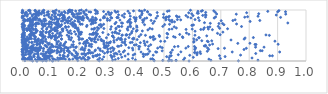
| Category | Series 0 |
|---|---|
| 0.20659024617600152 | 0.722 |
| 0.1595882859350992 | 0.769 |
| 0.5022783122837734 | 0.714 |
| 0.014627011601735303 | 0.221 |
| 0.8708775679135857 | 0.502 |
| 0.1238269095024919 | 0.456 |
| 0.2748066383766688 | 0.237 |
| 0.5081700501069504 | 0.863 |
| 0.5369264353859214 | 0.281 |
| 0.22940533535306296 | 0.403 |
| 0.0507291012930598 | 0.929 |
| 0.08151948562963185 | 0.039 |
| 0.23282890487622582 | 0.153 |
| 0.3509470010056096 | 0.419 |
| 0.1350176189112731 | 0.062 |
| 0.46287678871345395 | 0.481 |
| 0.011119935692606994 | 0.28 |
| 0.645812839691758 | 0.293 |
| 0.41077523659619003 | 0.284 |
| 0.38567772816234314 | 0.549 |
| 0.04700696801618684 | 0.032 |
| 0.6532315311546384 | 0.257 |
| 0.3492561073725203 | 0.304 |
| 0.011562703818986648 | 0.356 |
| 0.08128342170374568 | 0.69 |
| 0.21867603945372405 | 0.966 |
| 0.4439375430555527 | 0.231 |
| 0.24468991328158657 | 0.808 |
| 0.005265783653080119 | 0.597 |
| 0.03794246538813923 | 0.541 |
| 0.12398156293495016 | 0.216 |
| 0.5194820389745708 | 0.72 |
| 0.25600010063105594 | 0.641 |
| 0.5727020444227984 | 0.055 |
| 0.26732817516646984 | 0.42 |
| 0.16612893364222417 | 0.035 |
| 0.4982095696546795 | 0.854 |
| 0.2536260374636236 | 0.626 |
| 0.0406699299817603 | 0.248 |
| 0.2839238283861116 | 0.188 |
| 0.39290793220228815 | 0.43 |
| 0.5985147892601438 | 0.699 |
| 0.042279848248976404 | 0.533 |
| 0.4938443133912794 | 0.26 |
| 0.2620367883453557 | 0.82 |
| 0.16580611699807202 | 0.428 |
| 0.0004538340856108784 | 0.72 |
| 0.05547881544473306 | 0.153 |
| 0.06889590535984585 | 0.556 |
| 0.16266129144415303 | 0.567 |
| 0.8307884937646091 | 0.016 |
| 0.3338823724559998 | 0.415 |
| 0.1186083175830136 | 0.506 |
| 0.20101279854767606 | 0.421 |
| 0.0937517599832609 | 0.921 |
| 0.6934723897624867 | 0.735 |
| 0.20476507593976015 | 0.86 |
| 0.04120971670585925 | 0.914 |
| 0.1692985936536823 | 0.965 |
| 0.28629885539675737 | 0.845 |
| 0.0009645296041806804 | 0.123 |
| 0.5360201400004413 | 0.67 |
| 0.0014370166668378303 | 0.038 |
| 0.21203614964695036 | 0.722 |
| 0.08747721386081674 | 0.644 |
| 0.16131557928945228 | 0.939 |
| 0.05291620713172245 | 0.359 |
| 0.027992955133127384 | 0.2 |
| 0.07465261850898208 | 0.587 |
| 0.28460917675159086 | 0.558 |
| 0.06789787563027082 | 0.409 |
| 0.21964435155825754 | 0.205 |
| 0.09632525314077586 | 0.349 |
| 0.10674355390600654 | 0 |
| 0.4655703801737191 | 0.005 |
| 0.22894828137979076 | 0.699 |
| 0.23297248603286644 | 0.071 |
| 0.16661025624676912 | 0.999 |
| 0.1603126596140355 | 0.087 |
| 0.04164822182434544 | 0.091 |
| 0.0176482055008865 | 0.878 |
| 0.32437265296795914 | 0.143 |
| 0.17775796684123046 | 0.12 |
| 0.027276738055447277 | 0.626 |
| 0.35143894812218546 | 0.678 |
| 0.045162385770139826 | 0.445 |
| 0.2912353454635478 | 0.295 |
| 0.2892176773023869 | 0.266 |
| 0.044096376337534555 | 0.217 |
| 0.2268841744466071 | 0.907 |
| 0.19620719389889232 | 0.008 |
| 0.14626610581343039 | 0.867 |
| 0.08781791734118258 | 0.172 |
| 0.8025133796760705 | 0.348 |
| 0.5243593504559144 | 0.161 |
| 0.02098822196703764 | 0.631 |
| 0.013335016458879806 | 0.799 |
| 0.12421449983770834 | 0.269 |
| 0.6905324959657552 | 0.243 |
| 0.3610325074669338 | 0.353 |
| 0.22290135023622612 | 0.017 |
| 0.10838356848699818 | 0.974 |
| 0.15693293938461594 | 0.786 |
| 0.14487685588309934 | 0.629 |
| 0.1113108397096847 | 0.96 |
| 0.05356205250043837 | 0.316 |
| 0.09469819685250681 | 0.155 |
| 0.8589839340913255 | 0.511 |
| 0.4317664447428897 | 0.997 |
| 0.6911041914683271 | 0.679 |
| 0.10939038955609642 | 0.004 |
| 0.5471017215747025 | 0.866 |
| 0.4056647748065998 | 0.604 |
| 0.19133648937774336 | 0.276 |
| 0.027040897643454225 | 0.433 |
| 0.24328757192518413 | 0.722 |
| 0.1024548381636977 | 0.667 |
| 0.6462245286756323 | 0.306 |
| 0.25991960203038195 | 0.559 |
| 0.8335189610555185 | 0.927 |
| 0.1415411368095186 | 0.628 |
| 0.0024828525304180452 | 0.158 |
| 0.30916242139304845 | 0.798 |
| 0.3235359217249854 | 0.402 |
| 0.014480959060390633 | 0.241 |
| 0.5211368803131058 | 0.102 |
| 0.1691642494352353 | 0.784 |
| 0.03454848484715177 | 0.369 |
| 0.13327606586924912 | 0.891 |
| 0.31151177574057654 | 0.246 |
| 0.04881213250230101 | 0.6 |
| 0.16277831726001238 | 0.115 |
| 0.03190249505801583 | 0.7 |
| 0.3385858232046443 | 0.851 |
| 0.08122288258608408 | 0.823 |
| 0.11621952628377485 | 0.591 |
| 0.04997162793849228 | 0.733 |
| 0.23518029060121157 | 0.214 |
| 0.1592436388453549 | 0.199 |
| 0.4546871058741175 | 0.795 |
| 0.4882864956598092 | 0.387 |
| 0.3878387553159358 | 0.366 |
| 0.06302644759688579 | 0.031 |
| 0.6766067866337262 | 0.843 |
| 0.5503307607435864 | 0.124 |
| 0.7817152553280945 | 0.226 |
| 0.12068655454654995 | 0.997 |
| 0.3657626592831434 | 0.509 |
| 0.1808631187960183 | 0.378 |
| 0.09716807910446183 | 0.094 |
| 0.001384076321276523 | 0.384 |
| 0.40406813232669453 | 0.686 |
| 0.10815359367835606 | 0.288 |
| 0.38904668184431646 | 0.252 |
| 0.05471505679663392 | 0.918 |
| 0.09707649406101519 | 0.578 |
| 0.6172322283118868 | 0.158 |
| 0.043963096651518915 | 0.845 |
| 0.11875279015427284 | 0.596 |
| 0.598906335418971 | 0.703 |
| 0.30184307695230145 | 0.186 |
| 0.21444660732911167 | 0.873 |
| 0.2050735387628138 | 0.826 |
| 0.36508618736092824 | 0.316 |
| 0.24601927843579666 | 0.522 |
| 0.01054211126879861 | 0.278 |
| 0.1894064867385187 | 0.68 |
| 0.32424942918668864 | 0.369 |
| 0.5648944885562656 | 0.474 |
| 0.031350137540294545 | 0.511 |
| 0.17684319326314119 | 0.916 |
| 0.5058474946666024 | 0.838 |
| 0.3631104485357775 | 0.098 |
| 0.10888442027932162 | 0.491 |
| 0.20375756077747556 | 0.071 |
| 0.11538023529456093 | 0.425 |
| 0.01730898673225143 | 0.248 |
| 0.19331844124164738 | 0.057 |
| 0.3189638941699745 | 0.491 |
| 0.5854776324905514 | 0.284 |
| 0.0014813583867682464 | 0.995 |
| 0.5495039041374055 | 0.287 |
| 0.07966508959427449 | 0.732 |
| 0.11857767642573498 | 0.021 |
| 0.24678986670759645 | 0.432 |
| 0.39546911656590106 | 0.314 |
| 0.05548353004999401 | 0.071 |
| 0.3209536860948876 | 0.206 |
| 0.09246292701876972 | 0.968 |
| 0.6096083973993957 | 0.245 |
| 0.5689405532354916 | 0.026 |
| 0.14750735284607075 | 0.203 |
| 0.26614749646631203 | 0.111 |
| 0.001035197467917322 | 0.672 |
| 0.06048202339999591 | 0.235 |
| 0.03720410399813043 | 0.281 |
| 0.6048720527612496 | 0.369 |
| 0.6093937732804307 | 0.584 |
| 0.06404367304266861 | 0.515 |
| 0.6417404760977942 | 0.295 |
| 0.5777130001267884 | 0.619 |
| 0.1346083622079665 | 0.676 |
| 0.39272117986185145 | 0.982 |
| 0.007095069782430017 | 0.714 |
| 0.1354400369946144 | 0.911 |
| 0.0025038380344605403 | 0.286 |
| 0.2824165209557042 | 0.395 |
| 0.3914595178123973 | 0.117 |
| 0.4431684387093231 | 0.609 |
| 0.49583647471625975 | 0.679 |
| 0.3608749545211894 | 0.923 |
| 0.16566407035842437 | 0.487 |
| 0.8146413815942678 | 0.46 |
| 0.10232666570714039 | 0.172 |
| 0.11922928197169043 | 0.281 |
| 0.5335954819105253 | 0.479 |
| 0.17048895328163857 | 0.993 |
| 0.15844269186271073 | 0.606 |
| 0.20161780030830395 | 0.532 |
| 0.07652172436768921 | 0.465 |
| 0.14502810148243908 | 0.303 |
| 0.15391064075075325 | 0.371 |
| 0.13001858319130513 | 0.478 |
| 0.012332274579814484 | 0.284 |
| 0.6704643966010608 | 0.614 |
| 0.18004169486484828 | 0.679 |
| 0.3822092008412228 | 0.671 |
| 0.08496583280872767 | 0.728 |
| 0.21189344420179634 | 0.263 |
| 0.00067786258987428 | 0.52 |
| 0.09564867875752163 | 0.092 |
| 0.23686701963043397 | 0.297 |
| 0.5882558830141955 | 0 |
| 0.18602000775265515 | 0.715 |
| 0.24640169556907357 | 0.779 |
| 0.27578146007306265 | 0.803 |
| 0.706306244262066 | 0.736 |
| 0.07452652190579659 | 0.672 |
| 0.4133358792639825 | 0.988 |
| 0.3181603066708834 | 0.557 |
| 0.2262527956639703 | 0.136 |
| 0.608940895085316 | 0.506 |
| 0.029124502497427093 | 0.265 |
| 0.022072796214685986 | 0.419 |
| 0.26016946197287016 | 0.37 |
| 0.2601281489832459 | 0.807 |
| 0.41484987407648194 | 0.873 |
| 0.9105217026425342 | 0.855 |
| 0.09290613088603211 | 0.901 |
| 0.15267501034414271 | 0.036 |
| 0.07066888689289089 | 0.717 |
| 0.1162530270969112 | 0.937 |
| 0.14172093224614135 | 0.047 |
| 0.24712478355559098 | 0.751 |
| 0.1242015498111685 | 0.33 |
| 0.0004806410528458563 | 0.358 |
| 0.011827188728059974 | 0.166 |
| 0.027189088060341152 | 0.609 |
| 0.32832526606638485 | 0.026 |
| 0.003516153453418295 | 0.668 |
| 0.38104046738324526 | 0.688 |
| 0.6680501272599586 | 0.395 |
| 0.3310864011729484 | 0.628 |
| 0.062412648122791736 | 0.27 |
| 0.4832839810003716 | 0.501 |
| 0.19650988243713124 | 0.06 |
| 0.1367160303757769 | 0.307 |
| 0.16225861146729628 | 0.254 |
| 0.31630826174339316 | 0.066 |
| 0.16712534303095836 | 0.024 |
| 0.3350446191608294 | 0.851 |
| 0.5132704791749828 | 0.527 |
| 0.4458327686346637 | 0.289 |
| 0.06420603190999377 | 0.02 |
| 0.033188329352151255 | 0.267 |
| 0.587547246173089 | 0.524 |
| 0.17578838986154507 | 0.315 |
| 0.000559879192043743 | 0.848 |
| 0.638660864010759 | 0.619 |
| 0.6882940399962182 | 0.542 |
| 0.3731644744274738 | 0.977 |
| 0.1082050260761422 | 0.182 |
| 0.21525188184819147 | 0.8 |
| 0.6468641025522056 | 0.953 |
| 0.2587401034424371 | 0.842 |
| 0.25073038525274843 | 0.08 |
| 0.6223802113903425 | 0.457 |
| 0.07169908992704196 | 0.487 |
| 0.20217090744739907 | 0.987 |
| 0.09462666759605223 | 0.867 |
| 0.24445686967385788 | 0.281 |
| 0.28872158106115353 | 0.873 |
| 0.4524475951709396 | 0.46 |
| 0.03697898246112237 | 0.789 |
| 0.5369788338198008 | 0.768 |
| 0.901952602256966 | 0.328 |
| 0.18893539498625628 | 0.98 |
| 0.3807848701545044 | 0.726 |
| 0.5172210331118718 | 0.811 |
| 0.010208174140799104 | 0.006 |
| 0.015301478082729962 | 0.3 |
| 0.056898632940010505 | 0.949 |
| 0.5426794861192996 | 0.008 |
| 0.02812906856280369 | 0.475 |
| 0.0033407075730262155 | 0.078 |
| 0.03840374586450813 | 0.824 |
| 0.20956030358714628 | 0.042 |
| 0.025205612630865144 | 0.367 |
| 0.608492142315017 | 0.223 |
| 0.0027121371095979513 | 0.873 |
| 0.8654136636223431 | 0.973 |
| 0.9073019043401438 | 0.177 |
| 0.012079174223523188 | 0.903 |
| 0.2239023954365685 | 0.312 |
| 0.19678962212733825 | 0.594 |
| 0.21364778240186003 | 0.433 |
| 0.6312358832969048 | 0.976 |
| 0.31294274451966186 | 0.853 |
| 0.06955428612446946 | 0.033 |
| 0.03574735463992827 | 0.709 |
| 0.10409875809526933 | 0.755 |
| 0.05556017300357813 | 0.184 |
| 0.21147890812338752 | 0.81 |
| 0.19860831260014836 | 0.609 |
| 0.3247956389263706 | 0.094 |
| 0.252695597521039 | 0.624 |
| 0.5424316755186481 | 0.014 |
| 0.0771260830891967 | 0.818 |
| 0.4121596297625188 | 0.48 |
| 0.24200260078676036 | 0.959 |
| 0.3188686892853842 | 0.487 |
| 0.143907979071293 | 0.897 |
| 0.8229766712359886 | 0.147 |
| 0.7073486867303155 | 0.566 |
| 0.3904293291455712 | 0.216 |
| 0.07772885390485756 | 0.776 |
| 0.17467480712904265 | 0.143 |
| 0.04281970128047187 | 0.231 |
| 5.431080221243204e-05 | 0.413 |
| 0.19756983378993304 | 0.807 |
| 0.6420017041999769 | 0.651 |
| 0.23258967777264897 | 0.355 |
| 0.13161474042600316 | 0.828 |
| 0.2051648194283366 | 0.728 |
| 0.026795816143433796 | 0.693 |
| 0.35287378739711417 | 0.366 |
| 0.37185102000123177 | 0.765 |
| 0.19571682152255612 | 0.14 |
| 0.5594276328270639 | 0.179 |
| 0.14625545614304128 | 0.09 |
| 0.2909616841501067 | 0.852 |
| 0.07240806844197815 | 0.003 |
| 0.004612546325253447 | 0.234 |
| 0.12548082125996463 | 0.648 |
| 0.2324511510057638 | 0.831 |
| 0.03582168903961632 | 0.875 |
| 0.2502003161943865 | 0.813 |
| 0.10195739317108067 | 0.651 |
| 0.13607040296007855 | 0.557 |
| 0.005328136577268165 | 0.473 |
| 0.17706773749587904 | 0.922 |
| 0.2565263230333312 | 0.196 |
| 0.09495846639139159 | 0.554 |
| 0.08354928133116656 | 0.096 |
| 0.13864624854963362 | 0.2 |
| 0.6816298948643996 | 0.864 |
| 0.057314117406757785 | 0.117 |
| 0.13168989654820307 | 0.303 |
| 0.47204318060412176 | 0.84 |
| 0.16388584793131103 | 0.79 |
| 0.25822526846680555 | 0.106 |
| 0.12304481464122406 | 0.369 |
| 0.05331315112329353 | 0.141 |
| 0.30396862529691143 | 0.303 |
| 0.7855472801336173 | 0.451 |
| 0.09682079545509926 | 0.768 |
| 0.04149164545958091 | 0.114 |
| 0.019275996193591133 | 0.208 |
| 0.10463393829205622 | 0.091 |
| 0.2566016572105011 | 0.432 |
| 0.26700202167422676 | 0.024 |
| 0.03341497141195861 | 0.275 |
| 0.063787557221854 | 0.367 |
| 0.29675953472427363 | 0.298 |
| 0.07086007572908336 | 0.375 |
| 0.11831733881881239 | 0.869 |
| 0.24313837074691846 | 0.165 |
| 0.249644584846374 | 0.1 |
| 0.1322883577087804 | 0.703 |
| 0.1979130253196587 | 0.929 |
| 0.04826233886355602 | 0.901 |
| 0.013885763169103955 | 0.228 |
| 0.7910147944161134 | 0.946 |
| 0.010559148062655612 | 0.049 |
| 0.231211447223591 | 0.022 |
| 0.3183594027001147 | 0.264 |
| 0.8374532129776083 | 0.795 |
| 0.5435435461146995 | 0.647 |
| 0.25230234667905976 | 0.522 |
| 0.8455620335780614 | 0.201 |
| 0.5149886298647064 | 0.864 |
| 0.03458799863432333 | 0.292 |
| 0.009642111869437045 | 0.691 |
| 0.07550806712623541 | 0.984 |
| 0.1991119058424071 | 0.847 |
| 0.041553782617985105 | 0.225 |
| 0.11780268538977387 | 0.466 |
| 0.10172322528062593 | 0.266 |
| 0.09905233046397316 | 0.265 |
| 0.11818173644323096 | 0.459 |
| 0.005191002902795223 | 0.562 |
| 0.16272982987068188 | 0.206 |
| 0.2502713470616311 | 0.776 |
| 0.21503442054339247 | 0.223 |
| 0.09836742048751564 | 0.15 |
| 0.07884218925286582 | 0.888 |
| 0.26249890975368656 | 0.506 |
| 0.021008221785550424 | 0.82 |
| 0.0450346939699932 | 0.138 |
| 0.013503812825436652 | 0.212 |
| 0.4237750826593956 | 0.589 |
| 0.4167610594384276 | 0.359 |
| 0.02354199171189629 | 0.179 |
| 0.15188645507129733 | 0.949 |
| 0.477241318643473 | 0.881 |
| 0.4760355814946676 | 0.95 |
| 0.194216876456448 | 0.837 |
| 0.21664115304699968 | 0.343 |
| 0.616014755029678 | 0.121 |
| 0.33117164699895635 | 0.757 |
| 0.28886430612511593 | 0.324 |
| 0.32320467593711905 | 0.46 |
| 0.695807729084869 | 0.641 |
| 0.378564206070271 | 0.936 |
| 0.07674996982067657 | 0.386 |
| 0.05786385011023097 | 0.398 |
| 0.19737747516537288 | 0.777 |
| 0.03572000882715648 | 0.903 |
| 0.047505058746911584 | 0.726 |
| 0.4662026526907525 | 0.777 |
| 0.060182584005616886 | 0.982 |
| 0.32663638597902966 | 0.557 |
| 0.07519539734037083 | 0.193 |
| 0.44225687073603304 | 0.963 |
| 0.6463049251997398 | 0.861 |
| 0.028661002543484932 | 0.983 |
| 0.07290472558115581 | 0.959 |
| 0.4047932336662655 | 0.663 |
| 0.41867940673752174 | 0.517 |
| 0.3505019956890463 | 0.746 |
| 0.016646339552133897 | 0.266 |
| 0.3046845169804685 | 0.95 |
| 0.6572625409569633 | 0.228 |
| 0.1272681088304355 | 0.262 |
| 0.20625240633104805 | 0.561 |
| 0.15647858654926372 | 0.264 |
| 0.5180448733479821 | 0.066 |
| 0.15513617615325276 | 0.658 |
| 0.07701874846214948 | 0.014 |
| 0.14170809853195945 | 0.614 |
| 0.11370139232428421 | 0.634 |
| 0.7598497015771174 | 0.346 |
| 0.6210092652231334 | 0.847 |
| 0.03308978226651417 | 0.642 |
| 0.5768813033080089 | 0.252 |
| 0.005497066090367378 | 0.682 |
| 0.10708678693758661 | 0.811 |
| 0.06219740438626474 | 0.211 |
| 0.007991998508114488 | 0.644 |
| 0.4339350723019732 | 0.309 |
| 0.37384687017861384 | 0.135 |
| 0.0626811105887582 | 0.941 |
| 0.05461656468161765 | 0.748 |
| 0.07058622788822742 | 0.021 |
| 0.831098515523095 | 0.878 |
| 0.7730175103747339 | 0.676 |
| 0.05672844036249385 | 0.082 |
| 0.08438508688616933 | 0.381 |
| 0.11688646575158201 | 0.598 |
| 0.401079135428512 | 0.811 |
| 0.028730332055814697 | 0.727 |
| 0.3367156321083783 | 0.289 |
| 0.8204263556954542 | 0.325 |
| 0.041164300915691475 | 0.544 |
| 0.17023195707930655 | 0.592 |
| 0.028919424899153178 | 0.81 |
| 0.8906155476601897 | 0.389 |
| 0.03508216789089239 | 0.199 |
| 0.06555529521683558 | 0.27 |
| 0.030136459047378907 | 0.09 |
| 0.11412852379469388 | 0.976 |
| 0.11761950794490841 | 0.941 |
| 0.6288331294569456 | 0.145 |
| 0.10322692637489964 | 0.449 |
| 0.14691475731611547 | 0.092 |
| 0.35342734072309495 | 0.509 |
| 0.5663136237848112 | 0.459 |
| 0.21520237595549466 | 0.07 |
| 0.30240066935553356 | 0.233 |
| 0.7151071932123456 | 0.087 |
| 0.15186894686017938 | 0.274 |
| 0.18086043393349352 | 0.874 |
| 0.7111707180518894 | 0.711 |
| 0.7821722875546654 | 0.429 |
| 0.05559683135032669 | 0.955 |
| 0.13434909102402512 | 0.04 |
| 0.02532019765344555 | 0.048 |
| 0.03479800960339372 | 0.554 |
| 0.0036661593184268678 | 0.621 |
| 0.04211981596022961 | 0.259 |
| 0.48677828855483785 | 0.277 |
| 0.31274342427480717 | 0.11 |
| 0.44051306948545144 | 0.13 |
| 0.107995857893317 | 0.046 |
| 0.2767684763372809 | 0.718 |
| 0.14911214083147323 | 0.969 |
| 0.278844615326514 | 0.424 |
| 0.14836968565511907 | 0.825 |
| 0.3529770071183547 | 0.891 |
| 0.028153161495068763 | 0.838 |
| 0.05029232656069904 | 0.246 |
| 0.9279519736705375 | 0.966 |
| 0.5436594556769251 | 0.882 |
| 0.06501041300843252 | 0.57 |
| 0.2624661424584378 | 0.1 |
| 0.5118647469680786 | 0.974 |
| 0.15108804974329 | 0.744 |
| 0.0010262507906503944 | 0.489 |
| 0.13251087149758295 | 0.547 |
| 0.02990273052233488 | 0.185 |
| 0.12568091274964233 | 0.059 |
| 0.069639531017627 | 0.746 |
| 0.872391226779981 | 0.103 |
| 0.14227097561285482 | 0.844 |
| 0.04589570096213104 | 0.451 |
| 0.23821074565068898 | 0.788 |
| 0.16631339191168357 | 0.857 |
| 0.7238819012598396 | 0.632 |
| 0.04758114918784652 | 0.472 |
| 0.07667715940264472 | 0.996 |
| 0.46203213278265265 | 0.115 |
| 0.09760696772534135 | 0.019 |
| 0.05580706997920383 | 0.028 |
| 0.15893538769180332 | 0.507 |
| 0.03780363368259899 | 0.706 |
| 0.19819438151193255 | 0.484 |
| 0.32712389126702085 | 0.98 |
| 0.09674825004961429 | 0.72 |
| 0.05387397701606055 | 0.594 |
| 0.22814254074049903 | 0.399 |
| 0.1188807391096213 | 0.719 |
| 0.1395542510454665 | 0.714 |
| 0.22844039063740296 | 0.861 |
| 0.881606865349926 | 0.102 |
| 0.35163940239151686 | 0.503 |
| 0.1223386980419644 | 0.83 |
| 0.5273724603938768 | 0.007 |
| 0.06525108736095245 | 0.248 |
| 0.13239495837850188 | 0.677 |
| 0.28836469975231577 | 0.636 |
| 0.13871735077509886 | 0.783 |
| 0.08923654595051388 | 0.955 |
| 0.21061558342241082 | 0.138 |
| 0.08577671411035095 | 0.293 |
| 0.2658050186774883 | 0.938 |
| 0.2426609574728415 | 0.422 |
| 0.08984006439870365 | 0.06 |
| 0.356484109811478 | 0.176 |
| 0.03905243813959394 | 0.256 |
| 0.14554285728706431 | 0.827 |
| 0.7545150486029184 | 0.918 |
| 0.20079060237632246 | 0.56 |
| 0.03586887230638558 | 0.724 |
| 0.012593726241831976 | 0.266 |
| 0.030071622969705798 | 0.493 |
| 0.43140071848383665 | 0.346 |
| 0.14359404889177318 | 0.588 |
| 0.2959629946889766 | 0.916 |
| 0.21719721607401363 | 0.967 |
| 0.647887989649671 | 0.9 |
| 0.605470326442796 | 0.383 |
| 0.07574859129510368 | 0.241 |
| 0.07453001788522239 | 0.443 |
| 0.05847128537048956 | 0.798 |
| 0.6331439035930999 | 0.397 |
| 0.09223536318954875 | 0.731 |
| 0.06810479247879929 | 0.921 |
| 0.14990984928475304 | 0.341 |
| 0.3538421580410029 | 0.741 |
| 0.1744487857785773 | 0.455 |
| 0.05973402008105277 | 0.035 |
| 0.3460598822854401 | 0.422 |
| 0.01621471843189598 | 0.41 |
| 0.265043771622104 | 0.97 |
| 0.127973824172489 | 0.182 |
| 0.347179085705292 | 0.13 |
| 0.06727768185082297 | 0.142 |
| 0.45312497631295146 | 0.318 |
| 0.4985229531944528 | 0.916 |
| 0.15271565024591355 | 0.806 |
| 0.37610173708936023 | 0.261 |
| 0.20902277647237402 | 0.999 |
| 0.17384635997183867 | 0.537 |
| 0.3932974806356969 | 0.448 |
| 0.31264828606935974 | 0.179 |
| 0.12814563869633994 | 0.738 |
| 0.0924771693472356 | 0.182 |
| 0.40249275512271926 | 0.319 |
| 0.16728349040849524 | 0.184 |
| 0.049288091518327415 | 0.56 |
| 0.10717914107445195 | 0.48 |
| 0.12452488546953104 | 0.546 |
| 0.045009503677451934 | 0.544 |
| 0.4500387042990332 | 0.639 |
| 0.19186088071110666 | 0.047 |
| 0.18302769925486137 | 0.715 |
| 0.007248075952271406 | 0.038 |
| 0.09349339592767626 | 0.468 |
| 0.18093881892009694 | 0.278 |
| 0.007551837072669671 | 0.319 |
| 0.3239706388272097 | 0.241 |
| 0.10086659672203227 | 0.181 |
| 0.7504282763413676 | 0.808 |
| 0.0049636065031908915 | 0.796 |
| 0.9360480155440801 | 0.746 |
| 0.3705617133044515 | 0.63 |
| 0.1660229415619698 | 0.164 |
| 0.02015127387007009 | 0.045 |
| 0.16209423737058654 | 0.252 |
| 0.34101951574169354 | 0.288 |
| 0.18747410108628543 | 0.705 |
| 0.1263024089385191 | 0.787 |
| 0.4530697099647302 | 0.903 |
| 0.335072704981809 | 0.135 |
| 0.11270733975559862 | 0.749 |
| 0.08627707311577186 | 0.567 |
| 0.5993718848202371 | 0.625 |
| 0.5281680939966996 | 0.763 |
| 0.08725915105832303 | 0.903 |
| 0.18060964272396351 | 0.319 |
| 0.6164923059463187 | 0.161 |
| 0.189707201724532 | 0.525 |
| 0.056645892894869654 | 0.204 |
| 0.2720750967576056 | 0.005 |
| 0.12553652423771164 | 0.776 |
| 0.38378399275112834 | 0.753 |
| 0.14822666182326008 | 0.313 |
| 0.05561773436054188 | 0.205 |
| 0.14606875671562636 | 0.808 |
| 0.8033161982954787 | 0.775 |
| 0.03419052900716441 | 0.508 |
| 0.13894767164198676 | 0.436 |
| 0.06394649291650233 | 0.351 |
| 0.22283146170696025 | 0.106 |
| 0.37356646542821365 | 0.666 |
| 0.3007953755706077 | 0.796 |
| 0.12058266648650806 | 0.61 |
| 0.028933032919801288 | 0.03 |
| 0.03274321429464532 | 0.025 |
| 0.004363966291845503 | 0.535 |
| 0.1661326572174395 | 0.549 |
| 0.03400440518260688 | 0.059 |
| 0.1371606981279245 | 0.693 |
| 0.09973045648588369 | 0.582 |
| 0.5588455381146414 | 0.806 |
| 0.6425375584552421 | 0.751 |
| 0.08520870642791957 | 0.17 |
| 0.5112632426858432 | 0.458 |
| 0.07840081185600942 | 0.117 |
| 0.597419269601697 | 0.924 |
| 0.12854331929419402 | 0.386 |
| 0.07742012782341803 | 0.944 |
| 0.18013313839410974 | 0.921 |
| 0.042629267657990216 | 0.083 |
| 0.10227323934073193 | 0.46 |
| 0.1016214218657032 | 0.756 |
| 0.32738637426772565 | 0.73 |
| 0.13932538343424786 | 0.05 |
| 0.01979224165540324 | 0.633 |
| 0.6630995723734388 | 0.739 |
| 0.6953401172142999 | 0.104 |
| 0.6209642708211385 | 0.936 |
| 0.12467528267821631 | 0.591 |
| 0.15341808428091716 | 0.673 |
| 0.18701479055437303 | 0.652 |
| 0.2594546540401062 | 0.93 |
| 0.1152822928578321 | 0.606 |
| 0.000754919965010009 | 0.944 |
| 0.004561244090988459 | 0.198 |
| 0.023910468430795112 | 0.062 |
| 0.14042295038029295 | 0.948 |
| 0.6525173948317827 | 0.191 |
| 0.02938928471315489 | 0.939 |
| 0.20125454302311238 | 0.859 |
| 0.20975584128520341 | 0.562 |
| 0.12359678331152893 | 0.198 |
| 0.21763638118202258 | 0.055 |
| 0.904737555372249 | 0.987 |
| 0.24929542596703785 | 0.526 |
| 0.23719031193878168 | 0.208 |
| 0.03614542480638396 | 0.174 |
| 0.5215891819462247 | 0.786 |
| 0.39726014886086225 | 0.136 |
| 0.25543083391826116 | 0.426 |
| 0.1493536543520224 | 0.093 |
| 0.09653537129570684 | 0.517 |
| 0.013618817436070801 | 0.436 |
| 0.0627212035366214 | 0.804 |
| 0.5907473770567454 | 0.112 |
| 0.2703293434134973 | 0.638 |
| 0.08809508190660584 | 0.275 |
| 0.08132564899089993 | 0.081 |
| 0.8239880775438538 | 0.324 |
| 0.3389997827533646 | 0.05 |
| 0.07422172467771128 | 0.1 |
| 0.18892499409785576 | 0.262 |
| 0.20604081408358504 | 0.558 |
| 0.015206147843134803 | 0.634 |
| 0.4256385002986259 | 0.758 |
| 0.2511858338911222 | 0.54 |
| 0.032829078545249926 | 0.554 |
| 0.033146931049023165 | 0.581 |
| 0.03385770440921768 | 0.677 |
| 0.16192869873080484 | 0.236 |
| 0.1663025186115674 | 0.972 |
| 0.045213532780383744 | 0.837 |
| 0.03065107603314393 | 0.538 |
| 0.06598909427424846 | 0.783 |
| 0.07030104824921896 | 0.716 |
| 0.5094228948273807 | 0.085 |
| 0.008472167916298772 | 0.773 |
| 0.20735785115250574 | 0.935 |
| 0.3739940459700432 | 0.031 |
| 0.10753471717668077 | 0.617 |
| 0.280773665492984 | 0.694 |
| 0.08380422942190598 | 0.794 |
| 0.0827650596425843 | 0.146 |
| 0.3727340715760549 | 0.606 |
| 0.08117867004312353 | 0.48 |
| 0.04832885199828968 | 0.684 |
| 0.1044416435241682 | 0.312 |
| 0.22754545286211436 | 0.676 |
| 0.024811356429222744 | 0.675 |
| 0.10048851077870657 | 0.208 |
| 0.6984579828576317 | 0.049 |
| 0.11133575188457509 | 0.283 |
| 0.06572490128701107 | 0.508 |
| 0.6854963303942205 | 0.921 |
| 0.28734550949403714 | 0.97 |
| 0.006149914343421958 | 0.416 |
| 0.02043811243586392 | 0.251 |
| 0.31430669736229766 | 0.673 |
| 0.6037546902054268 | 0.707 |
| 0.4589642026048253 | 0.045 |
| 0.07305185994131078 | 0.981 |
| 0.3512430574411665 | 0.075 |
| 0.18794075372563537 | 0.855 |
| 0.7425353162442905 | 0.793 |
| 0.0282810408920378 | 0.254 |
| 0.7899475666306595 | 0.249 |
| 0.37590467149427714 | 0.792 |
| 0.08339718100839949 | 0.427 |
| 0.5393704902074945 | 0.465 |
| 0.1306959668998436 | 0.971 |
| 0.23504057845525683 | 0.158 |
| 0.003399083977975286 | 0.977 |
| 0.09702840244785232 | 0.245 |
| 0.08503582423465982 | 0.038 |
| 0.38134127103392496 | 0.361 |
| 0.4211323292559382 | 0.903 |
| 0.6976476368288856 | 0.515 |
| 0.1913205462825943 | 0.151 |
| 0.6524673940040143 | 0.388 |
| 0.1011742835477396 | 0.835 |
| 0.23570961414049557 | 0.964 |
| 0.3805627823662178 | 0.817 |
| 0.11439720096437847 | 0.872 |
| 0.3043607063547168 | 0.354 |
| 0.30947756473227295 | 0.353 |
| 0.07069750349302757 | 0.633 |
| 0.05752298441678999 | 0.434 |
| 0.3396752945359772 | 0.447 |
| 0.60922672103708 | 0.812 |
| 0.4777021035312172 | 0.253 |
| 0.3115111814149013 | 0.377 |
| 0.5931898167266877 | 0.995 |
| 0.18381414319597164 | 0.209 |
| 0.1720705679313948 | 0.413 |
| 0.062171406899770416 | 0.258 |
| 0.735980981015983 | 0.412 |
| 0.036774714258491235 | 0.757 |
| 0.6543468182570489 | 0.662 |
| 0.02901616239801496 | 0.146 |
| 0.5234511176928165 | 0.168 |
| 0.006546680052635231 | 0.061 |
| 0.20157690181341711 | 0.927 |
| 0.3398965387704002 | 0.906 |
| 0.012131096823747104 | 0.793 |
| 0.14783187976029674 | 0.894 |
| 0.04541905333040743 | 0.428 |
| 0.38945512382353237 | 0.435 |
| 0.2981360194253121 | 0.357 |
| 0.03368266507658645 | 0.201 |
| 0.03701686467894191 | 0.814 |
| 0.03184367861580144 | 0.595 |
| 0.09442377973068325 | 0.325 |
| 0.026687908914041464 | 0.994 |
| 0.4936023415297174 | 0.199 |
| 0.7696049832249177 | 0.116 |
| 0.22447307886196957 | 0.287 |
| 0.0027401458577558527 | 0.952 |
| 0.0653855864015494 | 0.26 |
| 0.003429503691483944 | 0.741 |
| 0.3200904865600006 | 0.49 |
| 0.05543984482651793 | 0.176 |
| 0.051436418601565635 | 0.327 |
| 0.21739209488802555 | 0.838 |
| 0.46311244953925834 | 0.418 |
| 0.19706925171235656 | 0.644 |
| 0.22580586124456728 | 0.375 |
| 0.5552610679111089 | 0.521 |
| 0.17706894986680496 | 0.707 |
| 0.34445687847960077 | 0.593 |
| 0.50634021666884 | 0.806 |
| 0.04817585070824213 | 0.631 |
| 0.13936241410891895 | 0.425 |
| 0.004621401394672873 | 0.246 |
| 0.38132317783270325 | 0.88 |
| 0.0247012888472507 | 0.678 |
| 0.4276662241036692 | 0.088 |
| 0.049707111346652524 | 0.389 |
| 0.13248214371676353 | 0.514 |
| 0.008362157795483615 | 0.551 |
| 0.8952884118272703 | 0.901 |
| 0.1638487133167234 | 0.671 |
| 0.046924728882073746 | 0.992 |
| 0.07557381583375758 | 0.248 |
| 0.001088603319936801 | 0.878 |
| 0.4407206620552505 | 0.374 |
| 0.3791062482812943 | 0.763 |
| 0.2652843001731174 | 0.657 |
| 0.449537888714824 | 0.189 |
| 0.05372752511859383 | 0.002 |
| 0.21811140471896118 | 0.944 |
| 0.02596932154138589 | 0.512 |
| 0.3009011287334189 | 0.168 |
| 0.020490029210939658 | 0.912 |
| 0.04067806182199161 | 0.317 |
| 0.010298854172897604 | 0.425 |
| 0.03996080426282976 | 0.798 |
| 0.061350794384993634 | 0.325 |
| 0.03170248702171651 | 0.271 |
| 0.1066657228463132 | 0.901 |
| 0.43149593325157937 | 0.712 |
| 0.07857594158854175 | 0.059 |
| 0.04449705898401873 | 0.377 |
| 0.22637083062757796 | 0.997 |
| 0.25490248828551093 | 0.383 |
| 0.2662457785459186 | 0.122 |
| 0.006805561961678082 | 0.435 |
| 0.7620567473602295 | 0.003 |
| 0.05020393892660432 | 0.747 |
| 0.1846293990884933 | 0.906 |
| 0.09026101848662424 | 0.349 |
| 0.1851613073350784 | 0.094 |
| 0.13265963224093727 | 0.172 |
| 0.0025342676602419525 | 0.708 |
| 0.6711527284043587 | 0.332 |
| 0.031148378817692307 | 0.781 |
| 0.24669255640517404 | 0.741 |
| 0.31202096359879133 | 0.624 |
| 0.45842296463689397 | 0.627 |
| 0.20137255298312884 | 0.454 |
| 0.3114775560947038 | 0.91 |
| 0.041583594191306694 | 0.823 |
| 0.2515433660266576 | 0.74 |
| 0.030285387441897613 | 0.176 |
| 0.06492734866155889 | 0.284 |
| 0.5839462969176394 | 0.861 |
| 0.45141596200325274 | 0.469 |
| 0.08644619223845844 | 0.101 |
| 0.13777761955905402 | 0.923 |
| 0.002211963984799056 | 0.648 |
| 0.03577902600498448 | 0.666 |
| 0.3308568831832418 | 0.643 |
| 0.419208933707401 | 0.175 |
| 0.5773251906599726 | 0.891 |
| 0.028698474051467505 | 0.148 |
| 0.3766321241370614 | 0.459 |
| 0.00897929579815656 | 0.339 |
| 0.013813975642929369 | 0.277 |
| 0.28271854779964306 | 0.03 |
| 0.24364222608879224 | 0.813 |
| 0.11710224595577237 | 0.493 |
| 0.14699538823107725 | 0.05 |
| 0.022675638834310927 | 0.989 |
| 0.23696381848382048 | 0.057 |
| 0.27177149270380563 | 0.704 |
| 0.02774001043777913 | 0.632 |
| 0.41999937948817384 | 0.975 |
| 0.055725173356921495 | 0.212 |
| 0.0841648827594259 | 0.557 |
| 0.12765908192023975 | 0.015 |
| 0.1490027832348463 | 0.161 |
| 0.14296198991592973 | 0.784 |
| 0.21915949620962616 | 0.146 |
| 0.03770476852848213 | 0.001 |
| 0.5157250663551816 | 0.006 |
| 0.04215925386302452 | 0.84 |
| 0.044808117759622464 | 0.483 |
| 0.22281410372721597 | 0.022 |
| 0.005643245473883882 | 0.878 |
| 0.1938058164969657 | 0.109 |
| 0.10755370793843042 | 0.541 |
| 0.4392923333629837 | 0.843 |
| 0.45305389429738313 | 0.039 |
| 0.02880497192276507 | 0.45 |
| 0.36100776932524703 | 0.202 |
| 0.005012318556134719 | 0.708 |
| 0.0919976640155801 | 0.217 |
| 0.16169281529882348 | 0.747 |
| 0.02225665462441452 | 0.439 |
| 0.10101763721193799 | 0.593 |
| 0.01841096496335766 | 0.472 |
| 0.9001445823136712 | 0.964 |
| 0.5189305844662762 | 0.875 |
| 0.6455248300240749 | 0.907 |
| 5.0550047904162884e-05 | 0.956 |
| 7.842055672083363e-05 | 0.185 |
| 0.013757146387371702 | 0.126 |
| 0.14942439786747502 | 0.853 |
| 0.5470867803571419 | 0.812 |
| 0.39932701197307624 | 0.023 |
| 0.029233500368387382 | 0.451 |
| 0.6808816463883245 | 0.954 |
| 0.08412743936412558 | 0.297 |
| 0.6362940892956349 | 0.894 |
| 0.635353181760937 | 0.988 |
| 0.2791403507429679 | 0.404 |
| 0.31671808772901405 | 0.087 |
| 0.13963920330749097 | 0.238 |
| 0.030203874791690313 | 0.244 |
| 0.3793485096270204 | 0.518 |
| 0.1616353716343646 | 0.835 |
| 0.3638293158554005 | 0.426 |
| 0.038704232603179164 | 0.631 |
| 0.23717270030037851 | 0.45 |
| 0.416351333464104 | 0.847 |
| 0.06169269930495158 | 0.82 |
| 0.30081213488731573 | 0.829 |
| 0.18787862694979143 | 0.081 |
| 0.27313384522802 | 0.123 |
| 0.23892593576535248 | 0.325 |
| 0.2882124977131377 | 0.352 |
| 0.3300901757407928 | 0.152 |
| 0.6562016568301055 | 0.627 |
| 0.0721829439185398 | 0.96 |
| 0.07383339299039342 | 0.495 |
| 0.24952827474739472 | 0.161 |
| 0.040418195224567174 | 0.615 |
| 0.27551581881824805 | 0.207 |
| 0.5181986972702276 | 0.62 |
| 0.05870382107107649 | 0.926 |
| 0.03013854299360882 | 0.141 |
| 0.3682993401652283 | 0.517 |
| 0.0008499212865834153 | 0.461 |
| 0.014204114849023165 | 0.337 |
| 0.33497950701505086 | 0.856 |
| 0.08613191294673639 | 0.006 |
| 0.20770454943098152 | 0.229 |
| 0.03370876744321906 | 0.525 |
| 0.6023650093724374 | 0.89 |
| 0.2568468515812122 | 0.795 |
| 0.42830040150348314 | 0.792 |
| 0.6271469755271565 | 0.181 |
| 0.17647167551109458 | 0.949 |
| 0.027369458066278687 | 0.094 |
| 0.24846789973888395 | 0.86 |
| 0.015389339076579215 | 0.951 |
| 0.12138211430150887 | 0.663 |
| 0.133640508780152 | 0.117 |
| 0.3382249830439395 | 0.678 |
| 0.17619511333037885 | 0.991 |
| 0.25172886420365936 | 0.554 |
| 0.12420027193280425 | 0.766 |
| 0.41192199523208806 | 0.235 |
| 0.01881012234822772 | 0.793 |
| 0.12306608875351296 | 0.158 |
| 0.07448270229256715 | 0.701 |
| 0.050312755534586674 | 0.876 |
| 0.32834676826538683 | 0.575 |
| 0.06904643450597732 | 0.413 |
| 0.017613783189325466 | 0.597 |
| 0.24588650578490862 | 0.626 |
| 0.006478659613087563 | 0.465 |
| 0.01066429703227283 | 0.922 |
| 0.055502216603292284 | 0.224 |
| 0.47452660391309703 | 0.173 |
| 0.1376513569845823 | 0.195 |
| 0.4418573518072301 | 0.968 |
| 0.8099358283299247 | 0.059 |
| 0.4843890142928899 | 0.481 |
| 0.34483040886790217 | 0.802 |
| 0.05348656795857679 | 0.837 |
| 0.468191487237196 | 0.434 |
| 0.272886567110414 | 0.475 |
| 0.20903946876063875 | 0.429 |
| 0.7129217888188488 | 0.25 |
| 0.045037593104492256 | 0.427 |
| 0.31488713080430786 | 0.944 |
| 0.14489791025309195 | 0.111 |
| 0.4440454849868268 | 0.142 |
| 0.040394555599735704 | 0.242 |
| 0.02012526449294856 | 0.297 |
| 0.2658593498200778 | 0.531 |
| 0.20470141143062826 | 0.521 |
| 0.6556874954934854 | 0.378 |
| 0.6171758877121708 | 0.937 |
| 0.24499454514736282 | 0.397 |
| 0.09959287150824385 | 0.496 |
| 0.4265189538864006 | 0.134 |
| 0.06986951122864939 | 0.785 |
| 0.10495971292720123 | 0.322 |
| 0.1229363606230702 | 0.713 |
| 0.3040207263569335 | 0.958 |
| 0.3993901775598087 | 0.779 |
| 0.7402010544088702 | 0.177 |
| 0.18495861135992056 | 0.574 |
| 0.024074257877641354 | 0.035 |
| 0.20325643945516478 | 0.346 |
| 0.004568126550806495 | 0.142 |
| 0.002416315534976662 | 0.172 |
| 0.7943941592996235 | 0.868 |
| 0.04930638808956681 | 0.261 |
| 0.3894409408007091 | 0.054 |
| 0.02502560885042949 | 0.803 |
| 0.6033184501003044 | 0.072 |
| 0.04767436689169699 | 0.204 |
| 0.1709985111062986 | 0.272 |
| 0.11910333399732655 | 0.409 |
| 0.16471245887575978 | 0.469 |
| 0.008326018453630126 | 0.608 |
| 0.13570446165979932 | 0.348 |
| 0.024042196987238838 | 0.693 |
| 0.11872565495644277 | 0.849 |
| 0.5105579614770429 | 0.542 |
| 0.02232619023731141 | 0.135 |
| 0.6243555641745138 | 0.794 |
| 0.07197095177115907 | 0.477 |
| 0.11428479133775482 | 0.815 |
| 0.0010284108360004327 | 0.216 |
| 0.024830974512680997 | 0.807 |
| 0.008394675577889386 | 0.552 |
| 0.2934684994496518 | 0.261 |
| 0.9285916764025732 | 0.919 |
| 0.29081014502420954 | 0.153 |
| 0.6082714379156402 | 0.17 |
| 0.0741039858395438 | 0.713 |
| 0.6504759632147469 | 0.493 |
| 0.6615650657253745 | 0.669 |
| 0.6070718160276618 | 0.285 |
| 0.4245948467578166 | 0.803 |
| 0.5533039022643611 | 0.865 |
| 0.25634502238072904 | 0.448 |
| 0.03443964770701585 | 0.358 |
| 0.3946936113198753 | 0.853 |
| 0.11402356781129305 | 0.199 |
| 0.5282704814014846 | 0.628 |
| 0.013176686929649423 | 0.045 |
| 0.13874120946295654 | 0.497 |
| 0.5948856825784168 | 0.845 |
| 0.2591390595466265 | 0.991 |
| 0.008727775769417735 | 0.507 |
| 0.22146535486440067 | 0.244 |
| 0.17873503931771068 | 0.037 |
| 0.4144175117268243 | 0.283 |
| 0.027295992685911197 | 0.599 |
| 0.29865025536088 | 0.274 |
| 0.0334468169632197 | 0.437 |
| 0.4021928465496357 | 0.847 |
| 0.11152594622675116 | 0.039 |
| 0.520426826414768 | 0.012 |
| 0.02905839576899867 | 0.799 |
| 0.17985574929688403 | 0.748 |
| 0.07339336611523598 | 0.518 |
| 0.26849009434335736 | 0.253 |
| 0.1346171460313722 | 0.248 |
| 0.01680046734016863 | 0.396 |
| 0.007601831017006697 | 0.11 |
| 0.0009665769707190464 | 0.468 |
| 0.04653711020515579 | 0.927 |
| 0.25955483721210165 | 0.543 |
| 0.27319053484901223 | 0.056 |
| 0.43467040181196537 | 0.503 |
| 0.3873640132796163 | 0.581 |
| 0.09935469665754987 | 0.476 |
| 0.8522113817380719 | 0.272 |
| 0.4955407997978202 | 0.01 |
| 0.27857251308125475 | 0.67 |
| 0.42277862005948946 | 0.969 |
| 0.10560062437386278 | 0.213 |
| 0.46350018387103387 | 0.024 |
| 0.30782980729268367 | 0.909 |
| 0.01593377269413467 | 0.178 |
| 0.008400523207868915 | 0.489 |
| 0.11914343658352769 | 0.746 |
| 0.3039996836715374 | 0.518 |
| 0.01415060559259195 | 0.412 |
| 0.04582230634922796 | 0.833 |
| 0.05738274894698509 | 0.416 |
| 0.07295831232027432 | 0.347 |
| 0.02148673184221483 | 0.803 |
| 0.1742672814329346 | 0.82 |
| 0.2971609633635045 | 0.455 |
| 0.10346121377684435 | 0.854 |
| 0.19021583503913045 | 0.175 |
| 0.07378558048670723 | 0.14 |
| 0.10183151966186652 | 0.175 |
| 0.434286122428816 | 0.126 |
| 0.2225726703224119 | 0.911 |
| 0.2649103647653752 | 0.599 |
| 0.05142736173947176 | 0.402 |
| 0.5253330534168955 | 0.104 |
| 0.05887151866181681 | 0.895 |
| 0.3311767281157202 | 0.955 |
| 0.7844136788319631 | 0.859 |
| 0.28790911084539805 | 0.08 |
| 0.04091765042589173 | 0.494 |
| 0.018526063765561814 | 0.035 |
| 0.1855689424226924 | 0.784 |
| 0.019886672608308304 | 0.609 |
| 0.19264580719832244 | 0.639 |
| 0.0811842133220937 | 0.306 |
| 0.03222423115398054 | 0.27 |
| 0.2013213840920687 | 0.77 |
| 0.11599943123555595 | 0.654 |
| 0.05026785180621159 | 0.583 |
| 0.012701200008873339 | 0.947 |
| 0.31609700413549774 | 0.843 |
| 0.047732619195911825 | 0.866 |
| 0.05967173871124317 | 0.734 |
| 0.22023270377247514 | 0.373 |
| 0.18708453700393218 | 0.068 |
| 0.6651695735806434 | 0.015 |
| 0.46108580830195967 | 0.738 |
| 0.039089574351326206 | 0.713 |
| 0.004556580360002561 | 0.498 |
| 0.09539291320551184 | 0.061 |
| 0.09879038204259616 | 0.104 |
| 0.4597432651953547 | 0.466 |
| 0.2875199194726546 | 0.72 |
| 0.17731989161423783 | 0.753 |
| 0.629639938425498 | 0.619 |
| 0.006863865911069163 | 0.521 |
| 0.34206022098319744 | 0.187 |
| 0.12255243046315609 | 0.333 |
| 0.6606026640539282 | 0.314 |
| 0.34265155387062546 | 0.674 |
| 0.08660340032286719 | 0.621 |
| 0.47064692383847967 | 0.179 |
| 0.021366901830050727 | 0.317 |
| 0.09445706996669186 | 0.677 |
| 0.6238273303061743 | 0.455 |
| 0.22943120695605604 | 0.853 |
| 0.1268129315441299 | 0.698 |
| 0.05113645932409483 | 0.003 |
| 0.1366444588737565 | 0.252 |
| 0.4297473863178773 | 0.39 |
| 0.05464470663603884 | 0.248 |
| 0.02844068180783366 | 0.022 |
| 0.34885361864827324 | 0.446 |
| 0.19300906506671292 | 0.927 |
| 0.5281930862463747 | 0.8 |
| 0.02590015763482509 | 0.673 |
| 0.31908977181505344 | 0.017 |
| 0.05622213461032126 | 0.4 |
| 0.002628730514545299 | 0.315 |
| 0.13811731142649658 | 0.918 |
| 0.2244138801229679 | 0.346 |
| 0.23920173903207023 | 0.524 |
| 0.40549867975890314 | 0.42 |
| 0.03447767589715778 | 0.24 |
| 0.43184377240149757 | 0.831 |
| 0.006025448401220421 | 0.235 |
| 0.6753152174341059 | 0.984 |
| 0.05098093662472149 | 0.902 |
| 0.0026542422114076065 | 0.873 |
| 0.517850930685597 | 0.983 |
| 0.004995261969206754 | 0.359 |
| 0.01111903730362975 | 0.373 |
| 0.038834545646441176 | 0.705 |
| 0.11508117310892714 | 0.928 |
| 0.17107161253017814 | 0.731 |
| 0.25752089941498535 | 0.999 |
| 0.13279130965348443 | 0.297 |
| 0.5295909729316653 | 0.215 |
| 0.03104745541632736 | 0.762 |
| 0.8224283349156853 | 0.271 |
| 0.03149316994597872 | 0.199 |
| 0.12616871293656354 | 0.808 |
| 0.0619218325186016 | 0.061 |
| 0.2592131601954519 | 0.753 |
| 0.20997275090752685 | 0.841 |
| 0.6079515590411502 | 0.162 |
| 0.03268415946340156 | 0.018 |
| 0.19528656036913783 | 0.877 |
| 0.04882323728474304 | 0.197 |
| 0.1533000013138412 | 0.671 |
| 0.08563544623308834 | 0.082 |
| 0.04852690768278139 | 0.81 |
| 0.2586207574737136 | 0.214 |
| 0.6149508899280367 | 0.415 |
| 0.42294769159055556 | 0.931 |
| 0.1045553762465317 | 0.713 |
| 0.11639880381084211 | 0.477 |
| 0.23983343823358166 | 0.438 |
| 0.3343703759942249 | 0.544 |
| 0.4027798345047311 | 0.586 |
| 0.01037747502442798 | 0.388 |
| 7.744438082143927e-05 | 0.228 |
| 0.8392627010497695 | 0.203 |
| 0.4277519809202971 | 0.132 |
| 0.0561736242884551 | 0.729 |
| 0.20760575184952298 | 0.526 |
| 0.6194947515999422 | 0.975 |
| 0.21369138903163798 | 0.84 |
| 0.10027155177971553 | 0.478 |
| 0.12712243060577905 | 0.692 |
| 0.047648540694506705 | 0.727 |
| 0.027967427271392176 | 0.774 |
| 0.341500929220699 | 0.537 |
| 0.017229100983391265 | 0.246 |
| 0.6580965105740061 | 0.036 |
| 0.28760317970187893 | 0.391 |
| 0.02835014601672911 | 0.458 |
| 0.391952717403216 | 0.631 |
| 0.06285157288743946 | 0.269 |
| 0.16313192819601366 | 0.984 |
| 0.0668016186632207 | 0.531 |
| 0.1491469974345 | 0.863 |
| 0.08315203064887972 | 0.009 |
| 0.21436499680480056 | 0.137 |
| 0.12713344239780594 | 0.907 |
| 0.241251878499098 | 0.154 |
| 0.36192246927359195 | 0.381 |
| 0.012456126718851889 | 0.232 |
| 0.39900642377040035 | 0.818 |
| 0.0710061031107807 | 0.549 |
| 0.7555563925686888 | 0.726 |
| 0.5870093124374023 | 0.944 |
| 0.35987444769019494 | 0.859 |
| 0.605096571735196 | 0.435 |
| 0.7013647352393331 | 0.79 |
| 0.0076502121368900704 | 0.823 |
| 0.05539916834450095 | 0.34 |
| 0.2609824244562341 | 0.473 |
| 0.33751873690841866 | 0.968 |
| 0.2453381139609691 | 0.325 |
| 0.4485066507461105 | 0.914 |
| 0.3685962178947539 | 0.508 |
| 0.5791248497225826 | 0.548 |
| 0.6112232076545989 | 0.26 |
| 0.04996138833843374 | 0.963 |
| 0.14874449978695312 | 0.242 |
| 0.5027336032382549 | 0.386 |
| 0.04536344585716305 | 0.986 |
| 0.25077584204967146 | 0.801 |
| 0.09071847529278843 | 0.097 |